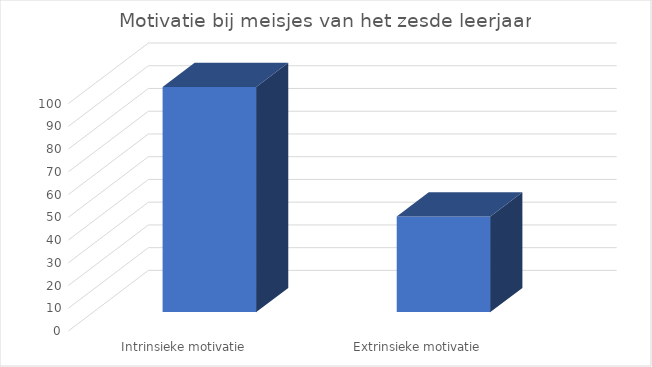
| Category | Series 0 |
|---|---|
| Intrinsieke motivatie | 99 |
| Extrinsieke motivatie | 42 |